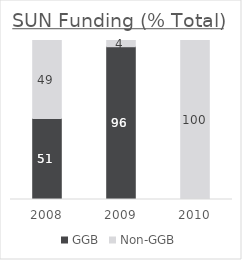
| Category | GGB | Non-GGB |
|---|---|---|
| 2008.0 | 50.911 | 49.089 |
| 2009.0 | 96.083 | 3.917 |
| 2010.0 | 0 | 100 |